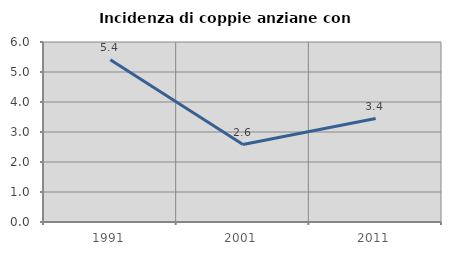
| Category | Incidenza di coppie anziane con figli |
|---|---|
| 1991.0 | 5.405 |
| 2001.0 | 2.581 |
| 2011.0 | 3.448 |